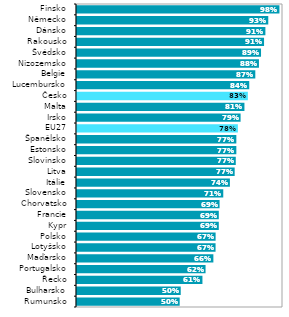
| Category | Series 1 |
|---|---|
| Rumunsko | 0.498 |
| Bulharsko | 0.504 |
| Řecko | 0.609 |
| Portugalsko | 0.624 |
| Maďarsko | 0.662 |
| Lotyšsko | 0.673 |
| Polsko | 0.673 |
| Kypr | 0.688 |
| Francie | 0.688 |
| Chorvatsko | 0.692 |
| Slovensko | 0.71 |
| Itálie | 0.742 |
| Litva | 0.765 |
| Slovinsko | 0.771 |
| Estonsko | 0.773 |
| Španělsko | 0.773 |
| EU27 | 0.781 |
| Irsko | 0.794 |
| Malta | 0.813 |
| Česko | 0.829 |
| Lucembursko | 0.836 |
| Belgie | 0.866 |
| Nizozemsko | 0.883 |
| Švédsko | 0.893 |
| Rakousko | 0.908 |
| Dánsko | 0.915 |
| Německo | 0.928 |
| Finsko | 0.983 |